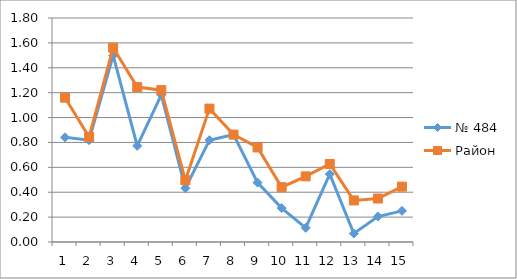
| Category | № 484 | Район |
|---|---|---|
| 0 | 0.841 | 1.16 |
| 1 | 0.818 | 0.844 |
| 2 | 1.5 | 1.562 |
| 3 | 0.773 | 1.245 |
| 4 | 1.182 | 1.22 |
| 5 | 0.432 | 0.496 |
| 6 | 0.818 | 1.072 |
| 7 | 0.864 | 0.863 |
| 8 | 0.477 | 0.76 |
| 9 | 0.273 | 0.44 |
| 10 | 0.114 | 0.527 |
| 11 | 0.545 | 0.627 |
| 12 | 0.068 | 0.334 |
| 13 | 0.205 | 0.349 |
| 14 | 0.25 | 0.445 |